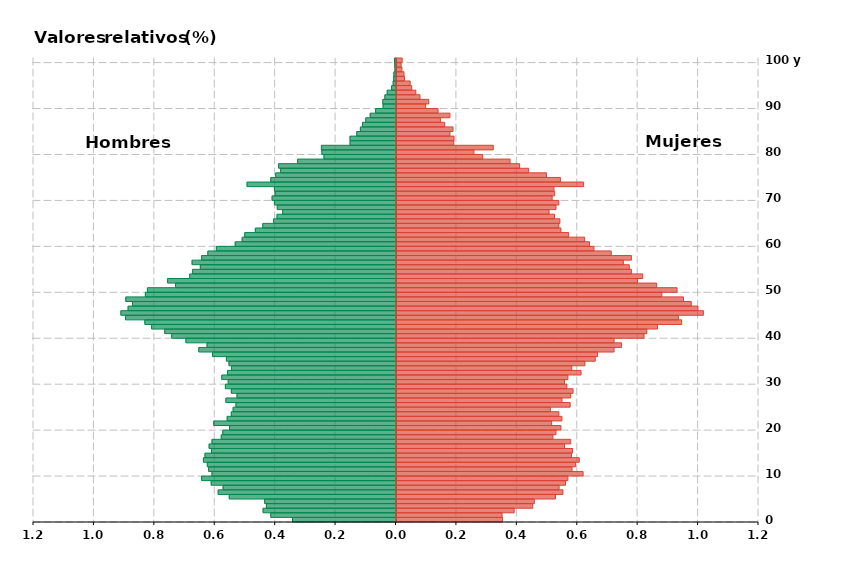
| Category | Hombres | Mujeres |
|---|---|---|
| 0 | -0.343 | 0.351 |
| 1 | -0.414 | 0.349 |
| 2 | -0.44 | 0.39 |
| 3 | -0.429 | 0.451 |
| 4 | -0.435 | 0.456 |
| 5 | -0.552 | 0.526 |
| 6 | -0.589 | 0.551 |
| 7 | -0.572 | 0.538 |
| 8 | -0.612 | 0.56 |
| 9 | -0.643 | 0.567 |
| 10 | -0.609 | 0.618 |
| 11 | -0.62 | 0.581 |
| 12 | -0.625 | 0.593 |
| 13 | -0.637 | 0.605 |
| 14 | -0.632 | 0.579 |
| 15 | -0.611 | 0.583 |
| 16 | -0.619 | 0.556 |
| 17 | -0.609 | 0.577 |
| 18 | -0.578 | 0.518 |
| 19 | -0.573 | 0.528 |
| 20 | -0.551 | 0.544 |
| 21 | -0.603 | 0.513 |
| 22 | -0.559 | 0.548 |
| 23 | -0.545 | 0.537 |
| 24 | -0.539 | 0.509 |
| 25 | -0.53 | 0.575 |
| 26 | -0.563 | 0.548 |
| 27 | -0.526 | 0.577 |
| 28 | -0.545 | 0.584 |
| 29 | -0.565 | 0.564 |
| 30 | -0.555 | 0.556 |
| 31 | -0.577 | 0.567 |
| 32 | -0.558 | 0.611 |
| 33 | -0.544 | 0.58 |
| 34 | -0.553 | 0.624 |
| 35 | -0.561 | 0.658 |
| 36 | -0.607 | 0.666 |
| 37 | -0.653 | 0.72 |
| 38 | -0.625 | 0.745 |
| 39 | -0.695 | 0.72 |
| 40 | -0.742 | 0.819 |
| 41 | -0.766 | 0.829 |
| 42 | -0.809 | 0.864 |
| 43 | -0.831 | 0.944 |
| 44 | -0.895 | 0.933 |
| 45 | -0.911 | 1.016 |
| 46 | -0.887 | 0.998 |
| 47 | -0.872 | 0.976 |
| 48 | -0.895 | 0.95 |
| 49 | -0.83 | 0.878 |
| 50 | -0.823 | 0.929 |
| 51 | -0.73 | 0.861 |
| 52 | -0.756 | 0.798 |
| 53 | -0.683 | 0.815 |
| 54 | -0.673 | 0.778 |
| 55 | -0.648 | 0.771 |
| 56 | -0.675 | 0.751 |
| 57 | -0.643 | 0.778 |
| 58 | -0.623 | 0.711 |
| 59 | -0.595 | 0.654 |
| 60 | -0.532 | 0.639 |
| 61 | -0.509 | 0.623 |
| 62 | -0.501 | 0.57 |
| 63 | -0.466 | 0.544 |
| 64 | -0.441 | 0.537 |
| 65 | -0.405 | 0.541 |
| 66 | -0.394 | 0.523 |
| 67 | -0.375 | 0.505 |
| 68 | -0.393 | 0.528 |
| 69 | -0.402 | 0.537 |
| 70 | -0.41 | 0.515 |
| 71 | -0.4 | 0.524 |
| 72 | -0.402 | 0.521 |
| 73 | -0.493 | 0.619 |
| 74 | -0.414 | 0.543 |
| 75 | -0.398 | 0.496 |
| 76 | -0.382 | 0.437 |
| 77 | -0.389 | 0.408 |
| 78 | -0.326 | 0.376 |
| 79 | -0.238 | 0.285 |
| 80 | -0.245 | 0.256 |
| 81 | -0.247 | 0.32 |
| 82 | -0.152 | 0.19 |
| 83 | -0.152 | 0.191 |
| 84 | -0.13 | 0.177 |
| 85 | -0.118 | 0.187 |
| 86 | -0.111 | 0.16 |
| 87 | -0.1 | 0.145 |
| 88 | -0.085 | 0.177 |
| 89 | -0.067 | 0.138 |
| 90 | -0.043 | 0.097 |
| 91 | -0.044 | 0.107 |
| 92 | -0.037 | 0.078 |
| 93 | -0.029 | 0.064 |
| 94 | -0.015 | 0.05 |
| 95 | -0.009 | 0.045 |
| 96 | -0.008 | 0.026 |
| 97 | -0.007 | 0.025 |
| 98 | -0.003 | 0.018 |
| 99 | -0.004 | 0.015 |
| 100 | -0.005 | 0.019 |